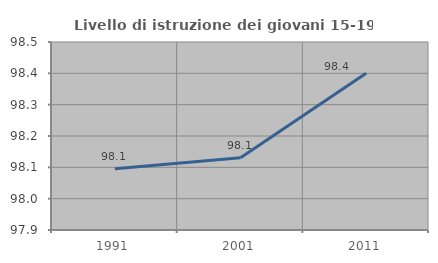
| Category | Livello di istruzione dei giovani 15-19 anni |
|---|---|
| 1991.0 | 98.095 |
| 2001.0 | 98.131 |
| 2011.0 | 98.4 |